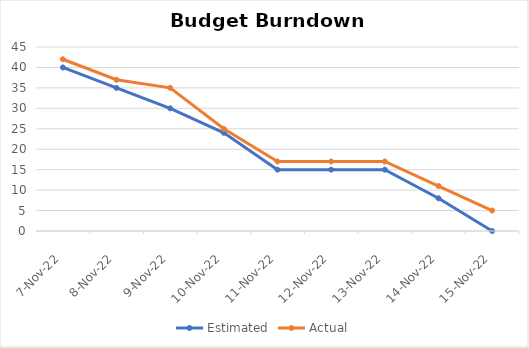
| Category | Estimated | Actual |
|---|---|---|
| 2022-11-07 | 40 | 42 |
| 2022-11-08 | 35 | 37 |
| 2022-11-09 | 30 | 35 |
| 2022-11-10 | 24 | 25 |
| 2022-11-11 | 15 | 17 |
| 2022-11-12 | 15 | 17 |
| 2022-11-13 | 15 | 17 |
| 2022-11-14 | 8 | 11 |
| 2022-11-15 | 0 | 5 |